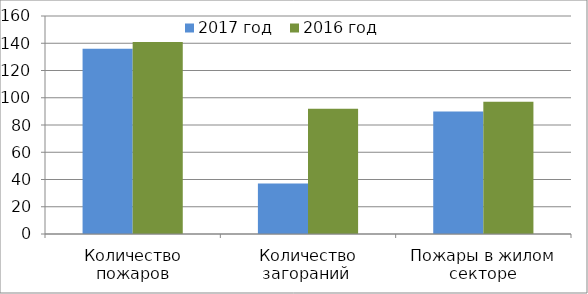
| Category | 2017 год | 2016 год |
|---|---|---|
| Количество пожаров | 136 | 141 |
| Количество загораний  | 37 | 92 |
| Пожары в жилом секторе | 90 | 97 |